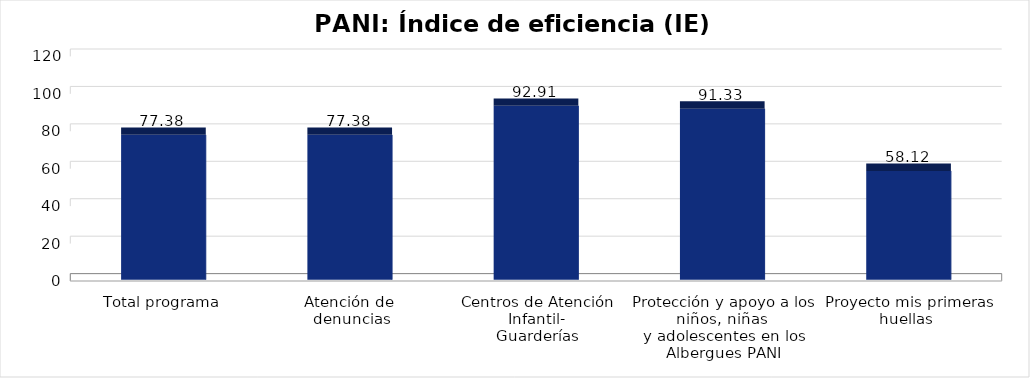
| Category | Índice de eficiencia (IE)  |
|---|---|
| Total programa | 77.375 |
| Atención de 
denuncias | 77.383 |
| Centros de Atención Infantil-
Guarderías | 92.906 |
| Protección y apoyo a los niños, niñas 
y adolescentes en los Albergues PANI | 91.326 |
| Proyecto mis primeras huellas  | 58.123 |